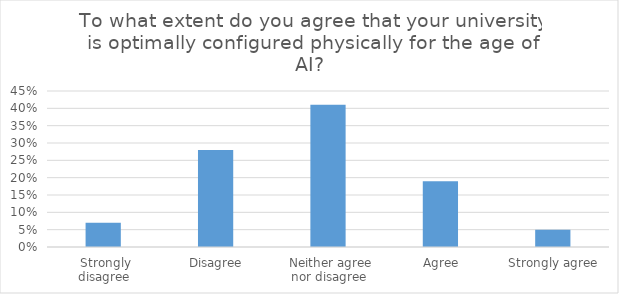
| Category | Series 0 |
|---|---|
|  Strongly disagree | 0.07 |
|  Disagree | 0.28 |
|  Neither agree nor disagree | 0.41 |
|  Agree | 0.19 |
|  Strongly agree | 0.05 |